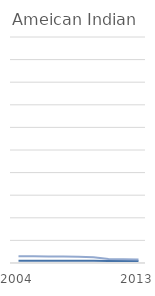
| Category | American Indian Staff | American Indian Student |
|---|---|---|
| 2004 | 1 | 3 |
|  | 1 | 3 |
|  | 1 | 2.9 |
|  | 1 | 2.9 |
|  | 1 | 2.8 |
|  | 1 | 2.5 |
|  | 0.9 | 1.8 |
|  | 0.9 | 1.7 |
| 2013 | 0.9 | 1.6 |